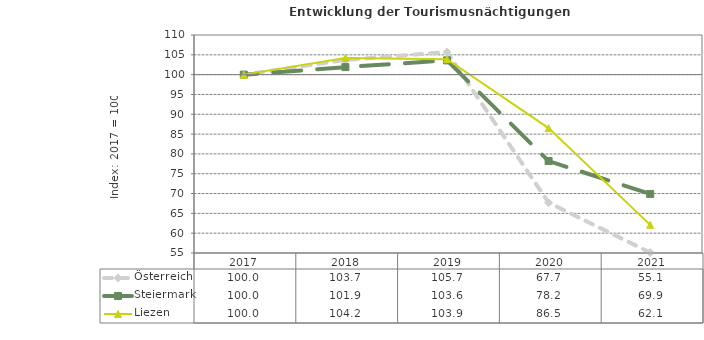
| Category | Österreich | Steiermark | Liezen |
|---|---|---|---|
| 2021.0 | 55.1 | 69.9 | 62.1 |
| 2020.0 | 67.7 | 78.2 | 86.5 |
| 2019.0 | 105.7 | 103.6 | 103.9 |
| 2018.0 | 103.7 | 101.9 | 104.2 |
| 2017.0 | 100 | 100 | 100 |